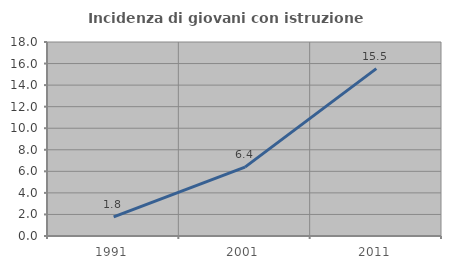
| Category | Incidenza di giovani con istruzione universitaria |
|---|---|
| 1991.0 | 1.773 |
| 2001.0 | 6.39 |
| 2011.0 | 15.53 |